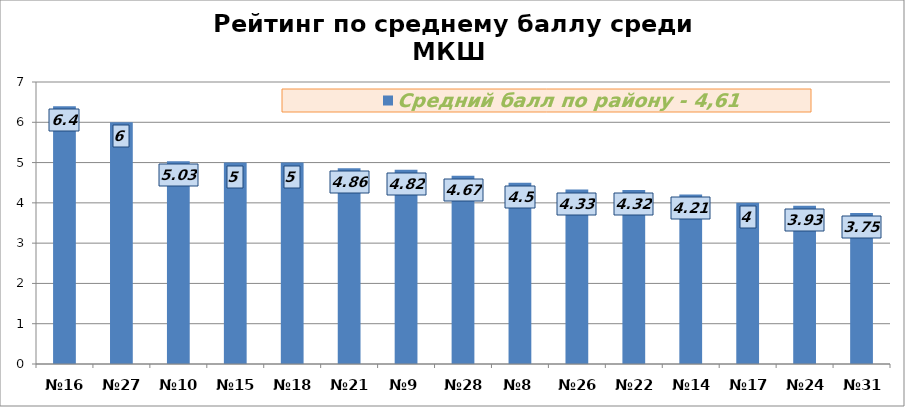
| Category | Средний балл по району - 4,61 |
|---|---|
| №16 | 6.4 |
| №27 | 6 |
| №10 | 5.03 |
| №15 | 5 |
| №18 | 5 |
| №21 | 4.86 |
| №9 | 4.82 |
| №28 | 4.67 |
| №8 | 4.5 |
| №26 | 4.33 |
| №22 | 4.32 |
| №14 | 4.21 |
| №17 | 4 |
| №24 | 3.93 |
| №31 | 3.75 |